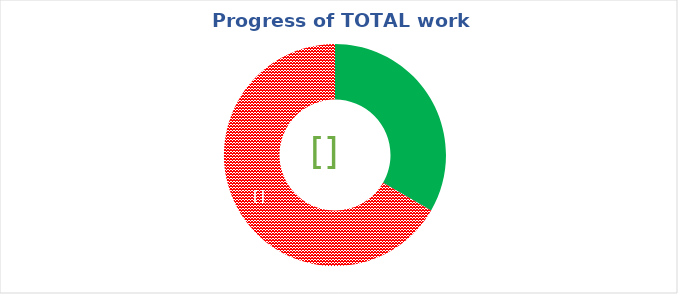
| Category | Series 0 |
|---|---|
| Total Rate of completion | 0.333 |
| Total Ongoing | 0 |
| Total Not Started | 0.667 |